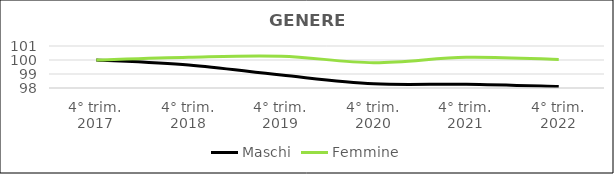
| Category | Maschi | Femmine |
|---|---|---|
| 4° trim.
2017 | 100 | 100 |
| 4° trim.
2018 | 99.648 | 100.204 |
| 4° trim.
2019 | 98.922 | 100.271 |
| 4° trim.
2020 | 98.299 | 99.809 |
| 4° trim.
2021 | 98.266 | 100.191 |
| 4° trim.
2022 | 98.101 | 100.04 |